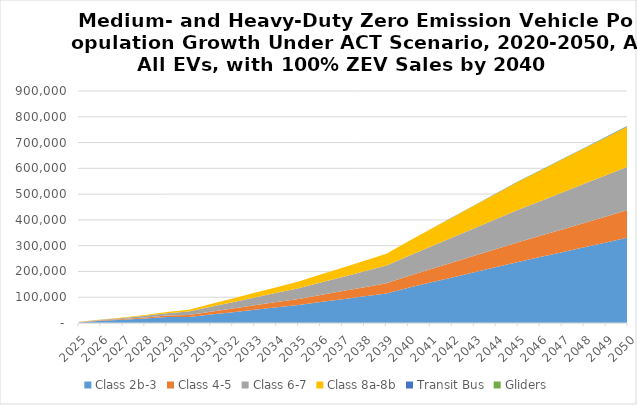
| Category | Class 2b-3 | Class 4-5 | Class 6-7 | Class 8a-8b | Transit Bus | Gliders |
|---|---|---|---|---|---|---|
| 2025.0 | 2046.527 | 790.941 | 1071.185 | 602.322 | 0 | 0 |
| 2026.0 | 8724.55 | 1651.338 | 2362.168 | 1291.27 | 0 | 0 |
| 2027.0 | 12759.788 | 2636.882 | 3984.124 | 2113.363 | 0 | 0 |
| 2028.0 | 17612.918 | 3915.627 | 6249.706 | 3147.119 | 0 | 0 |
| 2029.0 | 23432.924 | 5533.796 | 9332.17 | 4452.434 | 0 | 0 |
| 2030.0 | 23428.29 | 7640.015 | 13616.853 | 7182.419 | 0 | 0 |
| 2031.0 | 32738.382 | 10815.527 | 19190.216 | 10866.898 | 0 | 0 |
| 2032.0 | 42048.475 | 13991.039 | 24763.579 | 14551.377 | 0 | 0 |
| 2033.0 | 51358.567 | 17166.552 | 30336.943 | 18235.856 | 0 | 0 |
| 2034.0 | 60668.659 | 20342.064 | 35910.306 | 21920.335 | 0 | 0 |
| 2035.0 | 69978.752 | 23517.576 | 41483.669 | 25604.815 | 0 | 0 |
| 2036.0 | 81162.89 | 27532.681 | 48191.99 | 30801.431 | 0 | 0 |
| 2037.0 | 92347.028 | 31547.787 | 54900.31 | 35998.047 | 0 | 0 |
| 2038.0 | 103531.166 | 35562.892 | 61608.631 | 41194.664 | 0 | 0 |
| 2039.0 | 114715.304 | 39577.998 | 68316.951 | 46391.28 | 0 | 0 |
| 2040.0 | 136569.995 | 45367.371 | 78089.584 | 57044.054 | 148.379 | 115.779 |
| 2041.0 | 156652.207 | 51510.219 | 87648.366 | 67406.104 | 303.358 | 229.682 |
| 2042.0 | 176734.42 | 57653.066 | 97207.148 | 77768.153 | 458.337 | 343.585 |
| 2043.0 | 196816.632 | 63795.914 | 106765.93 | 88130.202 | 613.315 | 457.488 |
| 2044.0 | 216898.844 | 69938.761 | 116324.712 | 98492.252 | 768.294 | 571.391 |
| 2045.0 | 236981.056 | 76081.609 | 125883.494 | 108854.301 | 923.273 | 685.294 |
| 2046.0 | 255904.151 | 82164.695 | 134496.27 | 118277.003 | 1089.293 | 794.38 |
| 2047.0 | 274827.246 | 88247.781 | 143109.046 | 127699.706 | 1255.313 | 903.465 |
| 2048.0 | 293750.34 | 94330.868 | 151721.823 | 137122.409 | 1421.333 | 1012.55 |
| 2049.0 | 312673.435 | 100413.954 | 160334.599 | 146545.111 | 1587.353 | 1121.636 |
| 2050.0 | 331596.53 | 106497.04 | 168947.375 | 155967.814 | 1753.373 | 1230.721 |